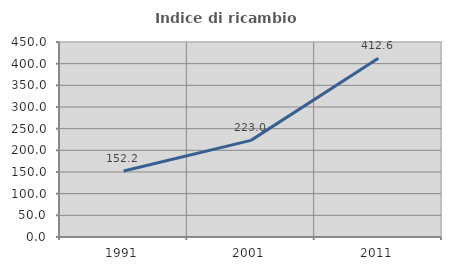
| Category | Indice di ricambio occupazionale  |
|---|---|
| 1991.0 | 152.198 |
| 2001.0 | 222.973 |
| 2011.0 | 412.605 |